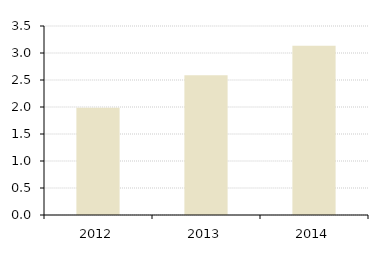
| Category | AR Turnover Ratio |
|---|---|
| 2012.0 | 1.986 |
| 2013.0 | 2.59 |
| 2014.0 | 3.134 |